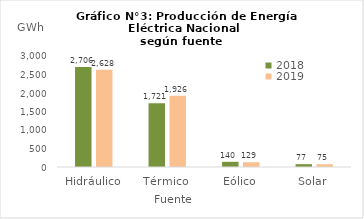
| Category | 2018 | 2019 |
|---|---|---|
| Hidráulico | 2705.554 | 2628.222 |
| Térmico | 1720.633 | 1925.851 |
| Eólico | 140.08 | 128.538 |
| Solar | 76.713 | 75.156 |